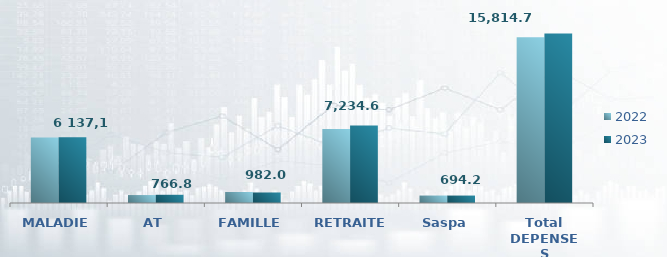
| Category | 2022 | 2023 |
|---|---|---|
| MALADIE | 6106.601 | 6137.247 |
| AT | 740.97 | 766.768 |
| FAMILLE | 1023.514 | 981.955 |
| RETRAITE | 6893.747 | 7234.571 |
| Saspa | 697.76 | 694.207 |
| Total DEPENSES | 15462.592 | 15814.748 |